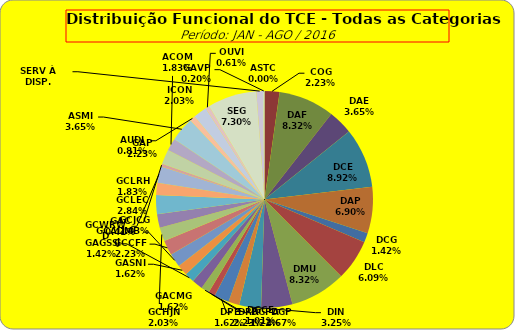
| Category | ASTC |
|---|---|
| ASTC | 0 |
| COG | 11 |
| DAF | 41 |
| DAE | 18 |
| DCE | 44 |
| DAP | 34 |
| DCG | 7 |
| DLC | 30 |
| DMU | 41 |
| DGP | 23 |
| DIN | 16 |
| DPE | 8 |
| DRR | 11 |
| DGCE | 5 |
| DGPA | 6 |
| GACMG | 8 |
| GAGSS | 7 |
| GASNI | 8 |
| GCADMFJ | 10 |
| GCCFF | 11 |
| GCHJN | 10 |
| GCJCG | 10 |
| GCLEC | 14 |
| GCLRH | 9 |
| GCWRWD | 12 |
| GAC | 2 |
| GAP | 11 |
| ACOM | 9 |
| ASMI | 18 |
| AUDI | 4 |
| ICON | 10 |
| OUVI | 3 |
| SEG | 36 |
| SERV À DISP. | 5 |
| GAVP | 1 |